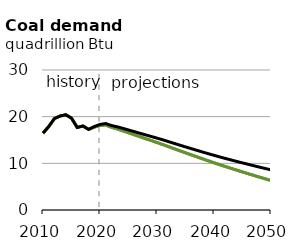
| Category | EAC | DAC | Reference |
|---|---|---|---|
| 2010.0 | 16.467 | 16.467 | 16.467 |
| 2011.0 | 17.868 | 17.868 | 17.868 |
| 2012.0 | 19.586 | 19.586 | 19.586 |
| 2013.0 | 20.144 | 20.144 | 20.144 |
| 2014.0 | 20.399 | 20.399 | 20.399 |
| 2015.0 | 19.684 | 19.684 | 19.684 |
| 2016.0 | 17.688 | 17.688 | 17.688 |
| 2017.0 | 18.001 | 18.001 | 18.001 |
| 2018.0 | 17.28 | 17.28 | 17.28 |
| 2019.0 | 17.752 | 17.752 | 17.885 |
| 2020.0 | 18.098 | 18.098 | 18.338 |
| 2021.0 | 18.211 | 18.211 | 18.524 |
| 2022.0 | 17.735 | 17.735 | 18.108 |
| 2023.0 | 17.377 | 17.377 | 17.831 |
| 2024.0 | 16.974 | 16.974 | 17.501 |
| 2025.0 | 16.551 | 16.551 | 17.147 |
| 2026.0 | 16.129 | 16.129 | 16.795 |
| 2027.0 | 15.708 | 15.708 | 16.444 |
| 2028.0 | 15.289 | 15.289 | 16.096 |
| 2029.0 | 14.875 | 14.875 | 15.752 |
| 2030.0 | 14.458 | 14.458 | 15.406 |
| 2031.0 | 14.029 | 14.029 | 15.044 |
| 2032.0 | 13.583 | 13.583 | 14.662 |
| 2033.0 | 13.134 | 13.134 | 14.277 |
| 2034.0 | 12.69 | 12.69 | 13.896 |
| 2035.0 | 12.253 | 12.253 | 13.523 |
| 2036.0 | 11.82 | 11.82 | 13.156 |
| 2037.0 | 11.387 | 11.387 | 12.787 |
| 2038.0 | 10.957 | 10.958 | 12.423 |
| 2039.0 | 10.535 | 10.535 | 12.066 |
| 2040.0 | 10.119 | 10.119 | 11.717 |
| 2041.0 | 9.711 | 9.711 | 11.375 |
| 2042.0 | 9.312 | 9.312 | 11.044 |
| 2043.0 | 8.921 | 8.921 | 10.721 |
| 2044.0 | 8.534 | 8.534 | 10.403 |
| 2045.0 | 8.153 | 8.153 | 10.09 |
| 2046.0 | 7.777 | 7.777 | 9.783 |
| 2047.0 | 7.404 | 7.404 | 9.479 |
| 2048.0 | 7.038 | 7.038 | 9.181 |
| 2049.0 | 6.677 | 6.677 | 8.889 |
| 2050.0 | 6.322 | 6.322 | 8.603 |